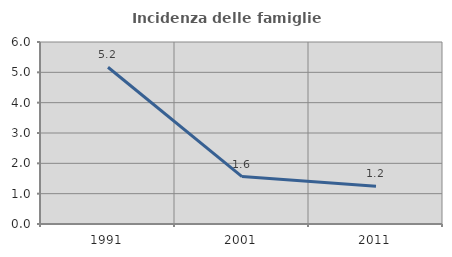
| Category | Incidenza delle famiglie numerose |
|---|---|
| 1991.0 | 5.168 |
| 2001.0 | 1.563 |
| 2011.0 | 1.246 |